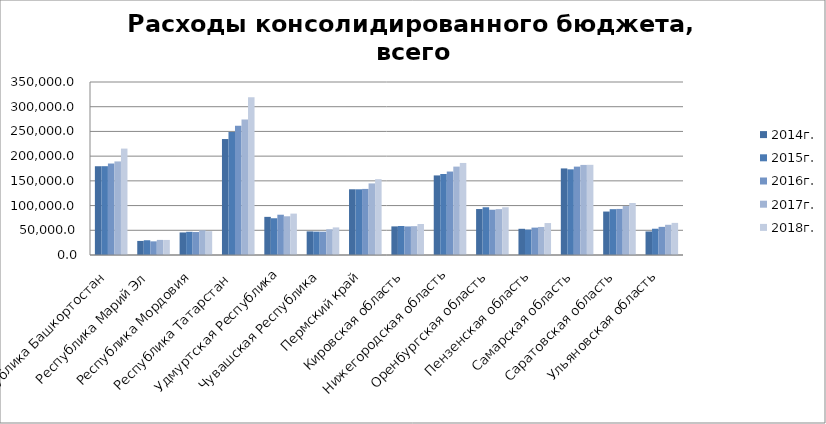
| Category | 2013г. | 2014г. | 2015г. | 2016г. | 2017г. | 2018г. |
|---|---|---|---|---|---|---|
| Республика Башкортостан |  | 179568.429 | 179677.825 | 185071.672 | 189306.95 | 215269.283 |
| Республика Марий Эл |  | 28458.986 | 29843.785 | 27631.154 | 30548.218 | 30481.672 |
| Республика Мордовия |  | 45626.289 | 46907.169 | 46445.769 | 49915.428 | 48196.332 |
| Республика Татарстан  |  | 234626.256 | 248936.554 | 261510.449 | 274013.748 | 319388.456 |
| Удмуртская Республика |  | 77156.631 | 74335.443 | 81509.763 | 78316.991 | 83726.398 |
| Чувашская Республика |  | 47741.375 | 47271.778 | 47131.257 | 51997.831 | 55807.679 |
| Пермский край |  | 132971.711 | 132909.451 | 133694.111 | 144833.881 | 153371.132 |
| Кировская область |  | 57888.348 | 58688.93 | 57766.456 | 58347.696 | 62707.296 |
| Нижегородская область |  | 160996.012 | 163884.689 | 168849.444 | 178839.501 | 186203.173 |
| Оренбургская область |  | 92993.485 | 96594.048 | 91589.016 | 92813.782 | 96608.283 |
| Пензенская область |  | 53009.352 | 51468.993 | 55394.877 | 56729.808 | 64638.336 |
| Самарская область |  | 175149.011 | 173301.27 | 178805.587 | 182254.648 | 182451.585 |
| Саратовская область |  | 87912.526 | 92718.003 | 93205.253 | 98987.538 | 105241.641 |
| Ульяновская область |  | 47570.631 | 53142.432 | 56941.557 | 61135.776 | 64948.939 |